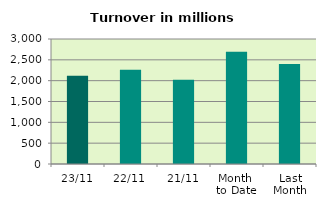
| Category | Series 0 |
|---|---|
| 23/11 | 2120.938 |
| 22/11 | 2259.702 |
| 21/11 | 2024.599 |
| Month 
to Date | 2692.332 |
| Last
Month | 2399.244 |